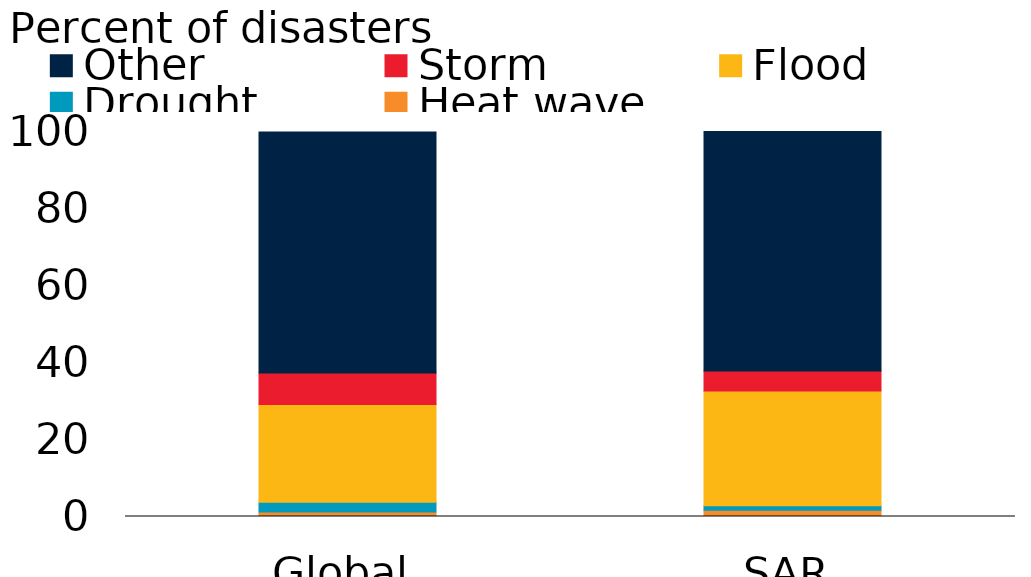
| Category | Heat wave | Drought | Flood | Storm | Other |
|---|---|---|---|---|---|
| Global | 1.2 | 2.5 | 25.4 | 8.2 | 62.6 |
| SAR | 1.6 | 1.2 | 29.8 | 5.2 | 62.2 |